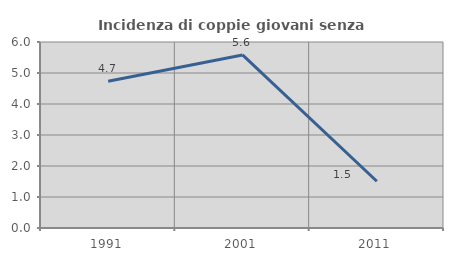
| Category | Incidenza di coppie giovani senza figli |
|---|---|
| 1991.0 | 4.737 |
| 2001.0 | 5.584 |
| 2011.0 | 1.508 |